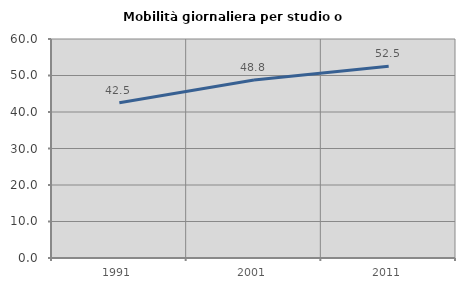
| Category | Mobilità giornaliera per studio o lavoro |
|---|---|
| 1991.0 | 42.515 |
| 2001.0 | 48.752 |
| 2011.0 | 52.511 |